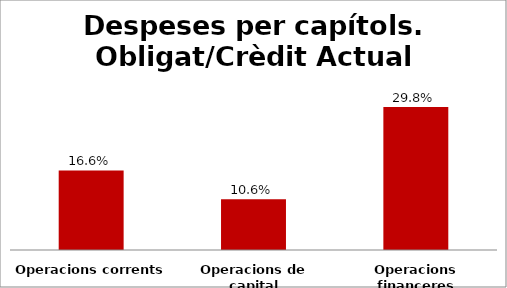
| Category | Series 0 |
|---|---|
| Operacions corrents | 0.166 |
| Operacions de capital | 0.106 |
| Operacions financeres | 0.298 |